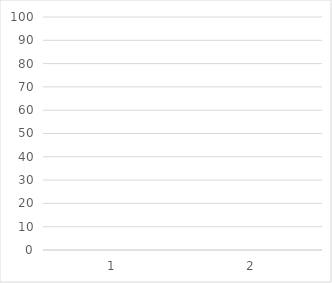
| Category | Series 0 |
|---|---|
| 0 | 67.536 |
| 1 | 28.366 |